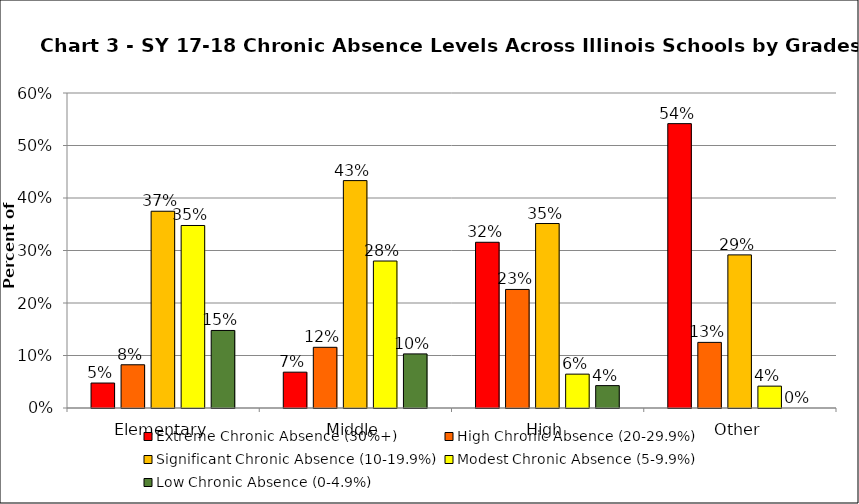
| Category | Extreme Chronic Absence (30%+) | High Chronic Absence (20-29.9%) | Significant Chronic Absence (10-19.9%) | Modest Chronic Absence (5-9.9%) | Low Chronic Absence (0-4.9%) |
|---|---|---|---|---|---|
| 0 | 0.048 | 0.082 | 0.375 | 0.348 | 0.148 |
| 1 | 0.068 | 0.116 | 0.433 | 0.28 | 0.103 |
| 2 | 0.316 | 0.226 | 0.351 | 0.065 | 0.043 |
| 3 | 0.542 | 0.125 | 0.292 | 0.042 | 0 |